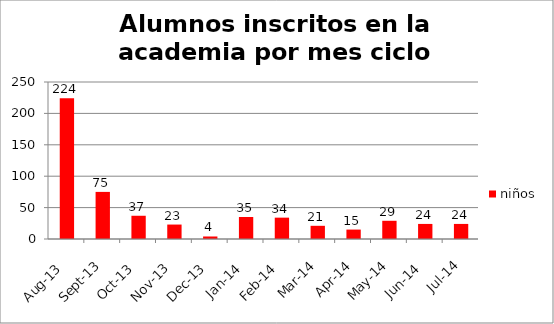
| Category | niños |
|---|---|
| 2013-08-01 | 224 |
| 2013-09-01 | 75 |
| 2013-10-01 | 37 |
| 2013-11-01 | 23 |
| 2013-12-01 | 4 |
| 2014-01-01 | 35 |
| 2014-02-01 | 34 |
| 2014-03-01 | 21 |
| 2014-04-01 | 15 |
| 2014-05-01 | 29 |
| 2014-06-01 | 24 |
| 2014-07-01 | 24 |